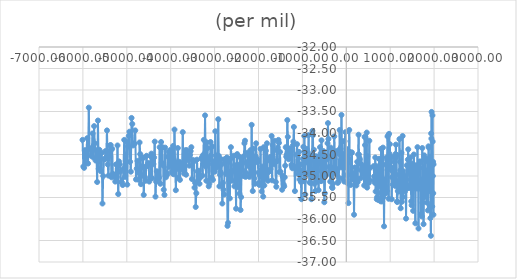
| Category | (per mil) |
|---|---|
| 1986.88 | -34.73 |
| 1983.99 | -35.9 |
| 1980.08 | -35.4 |
| 1976.37 | -34.67 |
| 1971.83 | -35 |
| 1967.33 | -34.2 |
| 1962.41 | -33.59 |
| 1957.62 | -35.71 |
| 1953.06 | -34.76 |
| 1947.75 | -34.71 |
| 1942.95 | -33.51 |
| 1938.21 | -34.13 |
| 1932.76 | -34.01 |
| 1927.46 | -36.39 |
| 1921.03 | -35.7 |
| 1915.12 | -35.98 |
| 1909.73 | -34.55 |
| 1903.32 | -34.94 |
| 1896.56 | -35.25 |
| 1890.69 | -34.96 |
| 1884.9 | -35.27 |
| 1878.68 | -34.34 |
| 1872.68 | -34.31 |
| 1865.9 | -35.35 |
| 1859.36 | -35.8 |
| 1853.17 | -34.61 |
| 1846.59 | -35.37 |
| 1839.08 | -35.62 |
| 1832.17 | -35.07 |
| 1826.73 | -34.93 |
| 1819.55 | -34.87 |
| 1811.43 | -35.44 |
| 1804.94 | -34.66 |
| 1797.57 | -35.22 |
| 1790.65 | -34.59 |
| 1783.79 | -35.5 |
| 1775.57 | -34.52 |
| 1768.16 | -35.05 |
| 1759.77 | -36.12 |
| 1752.74 | -35.09 |
| 1745.72 | -35.16 |
| 1737.3 | -35.62 |
| 1730.16 | -34.35 |
| 1722.77 | -35.94 |
| 1714.84 | -35.15 |
| 1706.74 | -35.31 |
| 1698.52 | -35.89 |
| 1691.22 | -35.09 |
| 1683.91 | -35.17 |
| 1676.8 | -34.66 |
| 1668.67 | -34.81 |
| 1660.0 | -34.82 |
| 1652.5 | -34.72 |
| 1645.0 | -36.22 |
| 1636.67 | -34.88 |
| 1629.67 | -35.29 |
| 1621.33 | -34.33 |
| 1613.67 | -35.26 |
| 1604.67 | -34.89 |
| 1597.0 | -35.23 |
| 1588.67 | -35.29 |
| 1581.0 | -34.9 |
| 1573.0 | -36.1 |
| 1564.0 | -34.75 |
| 1554.67 | -34.83 |
| 1546.5 | -35.23 |
| 1538.67 | -34.5 |
| 1530.67 | -35.14 |
| 1522.5 | -35.81 |
| 1512.67 | -35.05 |
| 1504.67 | -34.88 |
| 1497.0 | -34.71 |
| 1488.67 | -35.68 |
| 1479.75 | -35.59 |
| 1470.0 | -35.08 |
| 1460.33 | -34.57 |
| 1452.0 | -35.25 |
| 1443.5 | -34.93 |
| 1434.67 | -35.28 |
| 1427.0 | -34.62 |
| 1419.0 | -34.84 |
| 1410.67 | -34.38 |
| 1402.0 | -34.62 |
| 1393.5 | -35.28 |
| 1386.0 | -35.22 |
| 1377.33 | -34.75 |
| 1369.0 | -35.28 |
| 1361.0 | -35.99 |
| 1352.33 | -35.1 |
| 1343.67 | -35.26 |
| 1335.33 | -35.36 |
| 1326.67 | -35.11 |
| 1317.67 | -34.99 |
| 1309.33 | -34.99 |
| 1300.5 | -34.89 |
| 1291.5 | -35.49 |
| 1283.08 | -34.07 |
| 1274.37 | -34.95 |
| 1265.67 | -35.6 |
| 1256.8200000000002 | -34.46 |
| 1247.26 | -35.05 |
| 1238.9 | -35.75 |
| 1230.0 | -34.87 |
| 1219.8899999999999 | -34.67 |
| 1211.27 | -34.14 |
| 1201.1100000000001 | -35.36 |
| 1191.65 | -34.97 |
| 1182.7 | -35.12 |
| 1173.29 | -35.35 |
| 1163.45 | -35.6 |
| 1155.22 | -35.6 |
| 1146.22 | -34.51 |
| 1137.96 | -34.57 |
| 1130.04 | -34.27 |
| 1121.0 | -34.49 |
| 1112.47 | -35.23 |
| 1104.15 | -34.56 |
| 1095.5 | -35.12 |
| 1087.52 | -34.67 |
| 1077.9 | -35.01 |
| 1067.5700000000002 | -34.82 |
| 1060.27 | -35.2 |
| 1051.69 | -34.88 |
| 1043.21 | -35.03 |
| 1034.96 | -35.54 |
| 1025.05 | -34.57 |
| 1017.62 | -34.55 |
| 1008.96 | -34.85 |
| 1000.33 | -34.78 |
| 992.22 | -34.26 |
| 982.26 | -34.48 |
| 974.11 | -34.02 |
| 965.67 | -35.53 |
| 956.67 | -34.05 |
| 948.12 | -34.6 |
| 939.45 | -34.08 |
| 930.93 | -34.63 |
| 922.3900000000001 | -35.35 |
| 913.1600000000001 | -34.57 |
| 903.6800000000001 | -35.4 |
| 895.1700000000001 | -34.73 |
| 886.3299999999999 | -35.24 |
| 878.1500000000001 | -35.13 |
| 869.1500000000001 | -35.08 |
| 859.8699999999999 | -36.17 |
| 851.8199999999999 | -35.12 |
| 843.6400000000001 | -35.49 |
| 834.94 | -34.34 |
| 825.73 | -35.4 |
| 817.6800000000001 | -35.59 |
| 809.71 | -35.27 |
| 800.1500000000001 | -34.86 |
| 791.8199999999999 | -34.37 |
| 783.6199999999999 | -35.59 |
| 774.53 | -35.09 |
| 765.9100000000001 | -35.22 |
| 756.7 | -34.61 |
| 748.6800000000001 | -34.6 |
| 740.4300000000001 | -34.93 |
| 731.8800000000001 | -35.56 |
| 722.5899999999999 | -35.39 |
| 712.9000000000001 | -34.88 |
| 703.24 | -35.49 |
| 694.4300000000001 | -35.54 |
| 685.8299999999999 | -34.77 |
| 677.5999999999999 | -34.97 |
| 668.8900000000001 | -35.36 |
| 659.8499999999999 | -34.57 |
| 651.54 | -35.16 |
| 641.4300000000001 | -35.1 |
| 633.0 | -35.01 |
| 624.21 | -34.77 |
| 543.46 | -34.81 |
| 534.3199999999999 | -35.1 |
| 523.8499999999999 | -34.18 |
| 514.04 | -35.16 |
| 503.45000000000005 | -34.82 |
| 493.3699999999999 | -35.13 |
| 483.4100000000001 | -34.54 |
| 474.9200000000001 | -35.27 |
| 465.77 | -33.99 |
| 456.70000000000005 | -34.89 |
| 447.20000000000005 | -35.21 |
| 436.73 | -34.1 |
| 427.80999999999995 | -34.28 |
| 417.44000000000005 | -34.09 |
| 408.0999999999999 | -35.22 |
| 388.22 | -34.8 |
| 369.6199999999999 | -34.95 |
| 360.21000000000004 | -34.81 |
| 349.5 | -34.74 |
| 338.9100000000001 | -34.87 |
| 330.18000000000006 | -35.05 |
| 319.95000000000005 | -34.7 |
| 310.56999999999994 | -34.62 |
| 299.73 | -34.58 |
| 289.29999999999995 | -34.5 |
| 279.71000000000004 | -34.04 |
| 270.45000000000005 | -34.5 |
| 259.6400000000001 | -35.14 |
| 249.21000000000004 | -34.67 |
| 239.3699999999999 | -35.11 |
| 229.3599999999999 | -35.22 |
| 218.95000000000005 | -35.04 |
| 208.74 | -35.02 |
| 199.0 | -34.8 |
| 187.95000000000005 | -35.01 |
| 176.5 | -35.9 |
| 165.41000000000008 | -35.07 |
| 156.1099999999999 | -34.97 |
| 145.44000000000005 | -34.92 |
| 136.17000000000007 | -35.08 |
| 127.1099999999999 | -34.45 |
| 117.17000000000007 | -34.47 |
| 106.94000000000005 | -34.98 |
| 96.79999999999995 | -35.21 |
| 86.08999999999992 | -34.67 |
| 76.8900000000001 | -34.44 |
| 67.17000000000007 | -33.93 |
| 58.819999999999936 | -34.68 |
| 48.58999999999992 | -35.63 |
| 39.90000000000009 | -34.68 |
| 30.470000000000027 | -35.17 |
| 20.799999999999955 | -34.53 |
| 11.0 | -34.98 |
| 1.349999999999909 | -34.37 |
| -8.299999999999955 | -34.8 |
| -18.170000000000073 | -33.98 |
| -37.75 | -34.19 |
| -46.61999999999989 | -35.13 |
| -57.710000000000036 | -34.81 |
| -68.68000000000006 | -34.48 |
| -80.18000000000006 | -35.06 |
| -89.75 | -34.19 |
| -100.5 | -34.5 |
| -110.15999999999985 | -33.58 |
| -119.82000000000016 | -34.8 |
| -129.69999999999982 | -34.51 |
| -139.80999999999995 | -34.36 |
| -150.42999999999984 | -33.93 |
| -160.26999999999998 | -34.41 |
| -170.86000000000013 | -35.04 |
| -182.55999999999995 | -35.13 |
| -193.3800000000001 | -35.16 |
| -203.55000000000018 | -34.84 |
| -213.63999999999987 | -34.96 |
| -223.82999999999993 | -34.42 |
| -234.17000000000007 | -34.91 |
| -244.23999999999978 | -34.5 |
| -253.76000000000022 | -34.84 |
| -264.3000000000002 | -34.59 |
| -274.0 | -34.08 |
| -284.15999999999985 | -34.8 |
| -294.1500000000001 | -34.43 |
| -304.0 | -35.18 |
| -314.5500000000002 | -35.28 |
| -324.9000000000001 | -35.26 |
| -334.9499999999998 | -34.95 |
| -344.9499999999998 | -34.55 |
| -355.1100000000001 | -34.34 |
| -365.73 | -35.13 |
| -375.84000000000015 | -34.88 |
| -396.1999999999998 | -34.79 |
| -407.07000000000016 | -34.14 |
| -417.5799999999999 | -33.77 |
| -427.4499999999998 | -34.24 |
| -437.6100000000001 | -34.61 |
| -447.6300000000001 | -34.55 |
| -458.0999999999999 | -34.97 |
| -469.07000000000016 | -34.99 |
| -479.0 | -34.62 |
| -489.6700000000001 | -35.4 |
| -500.5799999999999 | -35.61 |
| -511.5 | -34.51 |
| -521.9000000000001 | -34.42 |
| -532.0799999999999 | -34.75 |
| -542.1500000000001 | -34.82 |
| -554.5300000000002 | -35.1 |
| -565.1300000000001 | -34.17 |
| -576.0 | -35.12 |
| -586.69 | -34.48 |
| -598.4499999999998 | -34.33 |
| -609.46 | -34.54 |
| -619.9499999999998 | -34.63 |
| -631.4000000000001 | -35.33 |
| -641.8899999999999 | -34.56 |
| -652.48 | -34.88 |
| -662.7600000000002 | -35.13 |
| -673.3899999999999 | -35.13 |
| -684.04 | -34.79 |
| -694.3499999999999 | -34.54 |
| -705.25 | -35.35 |
| -716.5500000000002 | -34.97 |
| -726.6999999999998 | -35.18 |
| -738.1999999999998 | -34.39 |
| -749.1700000000001 | -35.01 |
| -759.3600000000001 | -34.05 |
| -771.5300000000002 | -33.95 |
| -784.3200000000002 | -34.85 |
| -795.52 | -35.54 |
| -806.1399999999999 | -34.88 |
| -816.7399999999998 | -35.16 |
| -827.81 | -34.52 |
| -838.1399999999999 | -35.15 |
| -848.2600000000002 | -34.96 |
| -858.6999999999998 | -34.05 |
| -868.75 | -34.92 |
| -879.5300000000002 | -34.44 |
| -890.6300000000001 | -34.65 |
| -901.5999999999999 | -34.37 |
| -912.5 | -34.47 |
| -923.2600000000002 | -34.58 |
| -933.7800000000002 | -35.43 |
| -945.06 | -34.7 |
| -956.19 | -34.07 |
| -966.5 | -35.12 |
| -977.0500000000002 | -34.32 |
| -987.8000000000002 | -34.6 |
| -998.5900000000001 | -34.72 |
| -1010.23 | -34.88 |
| -1021.23 | -35.54 |
| -1032.81 | -35.14 |
| -1043.0 | -34.93 |
| -1054.0 | -34.73 |
| -1064.56 | -35.08 |
| -1075.44 | -34.44 |
| -1086.12 | -34.84 |
| -1097.1599999999999 | -34.95 |
| -1108.31 | -34.85 |
| -1120.4099999999999 | -34.26 |
| -1132.92 | -34.5 |
| -1145.6 | -34.82 |
| -1159.0 | -34.81 |
| -1170.17 | -35.35 |
| -1181.8899999999999 | -34.78 |
| -1194.15 | -33.86 |
| -1205.54 | -34.2 |
| -1217.4499999999998 | -34.29 |
| -1228.5700000000002 | -34.82 |
| -1238.5 | -34.78 |
| -1249.1399999999999 | -34.74 |
| -1260.9299999999998 | -34.42 |
| -1274.6799999999998 | -34.54 |
| -1286.71 | -34.36 |
| -1297.3899999999999 | -34.54 |
| -1309.0500000000002 | -34.61 |
| -1320.63 | -34.46 |
| -1332.44 | -34.09 |
| -1343.35 | -33.7 |
| -1355.4899999999998 | -34.5 |
| -1367.85 | -34.55 |
| -1379.4 | -34.33 |
| -1390.6999999999998 | -34.76 |
| -1403.0500000000002 | -35.03 |
| -1414.38 | -35.24 |
| -1426.5700000000002 | -35.2 |
| -1437.8200000000002 | -35.01 |
| -1449.88 | -35 |
| -1462.19 | -35.32 |
| -1498.4099999999999 | -34.9 |
| -1510.6799999999998 | -34.44 |
| -1522.9099999999999 | -34.91 |
| -1534.29 | -34.23 |
| -1546.5 | -34.16 |
| -1558.4 | -34.34 |
| -1569.4899999999998 | -34.65 |
| -1581.52 | -34.4 |
| -1593.9699999999998 | -35.25 |
| -1605.81 | -35.14 |
| -1618.1100000000001 | -34.68 |
| -1629.0 | -34.69 |
| -1640.56 | -34.18 |
| -1652.0300000000002 | -34.73 |
| -1665.2800000000002 | -34.63 |
| -1677.3200000000002 | -34.28 |
| -1689.3000000000002 | -35.1 |
| -1701.06 | -34.07 |
| -1713.9299999999998 | -34.65 |
| -1725.5900000000001 | -34.84 |
| -1736.7199999999998 | -34.56 |
| -1747.83 | -34.87 |
| -1760.0300000000002 | -34.88 |
| -1772.0700000000002 | -34.91 |
| -1784.5 | -35.11 |
| -1796.38 | -34.64 |
| -1808.1999999999998 | -34.24 |
| -1820.44 | -35.05 |
| -1832.6799999999998 | -34.41 |
| -1843.87 | -35.05 |
| -1855.92 | -34.93 |
| -1868.0900000000001 | -35.22 |
| -1880.56 | -34.33 |
| -1892.9099999999999 | -35.48 |
| -1905.1799999999998 | -34.92 |
| -1916.8200000000002 | -34.78 |
| -1928.8600000000001 | -35.36 |
| -1941.6 | -35.01 |
| -1953.94 | -34.37 |
| -1966.31 | -34.99 |
| -1979.1999999999998 | -35.21 |
| -1991.12 | -35.16 |
| -2003.5500000000002 | -34.92 |
| -2017.06 | -34.68 |
| -2029.4299999999998 | -34.61 |
| -2042.29 | -34.61 |
| -2054.45 | -34.24 |
| -2066.68 | -34.54 |
| -2080.21 | -35.18 |
| -2092.56 | -35.06 |
| -2104.94 | -34.63 |
| -2117.61 | -34.36 |
| -2130.64 | -35.35 |
| -2143.74 | -34.78 |
| -2155.8999999999996 | -33.81 |
| -2168.96 | -34.96 |
| -2182.1899999999996 | -34.4 |
| -2195.0 | -34.79 |
| -2207.5200000000004 | -35.02 |
| -2219.26 | -34.53 |
| -2231.8199999999997 | -34.76 |
| -2244.1499999999996 | -34.46 |
| -2256.6099999999997 | -34.7 |
| -2269.25 | -34.68 |
| -2281.6499999999996 | -34.93 |
| -2293.74 | -35.02 |
| -2307.38 | -34.18 |
| -2320.4700000000003 | -34.24 |
| -2332.6000000000004 | -34.54 |
| -2345.3199999999997 | -35 |
| -2357.3599999999997 | -34.69 |
| -2370.1400000000003 | -34.86 |
| -2383.33 | -34.59 |
| -2395.59 | -35.49 |
| -2409.0600000000004 | -35.79 |
| -2421.3599999999997 | -34.56 |
| -2434.2299999999996 | -35.41 |
| -2446.9399999999996 | -34.74 |
| -2460.21 | -34.79 |
| -2472.63 | -35.26 |
| -2485.4799999999996 | -34.49 |
| -2498.04 | -34.52 |
| -2510.3 | -35.76 |
| -2523.2200000000003 | -34.88 |
| -2536.16 | -34.75 |
| -2549.46 | -35.24 |
| -2562.88 | -34.53 |
| -2575.2700000000004 | -34.89 |
| -2588.3999999999996 | -34.87 |
| -2601.8900000000003 | -35.11 |
| -2615.08 | -34.58 |
| -2628.24 | -34.33 |
| -2640.8199999999997 | -34.9 |
| -2653.8999999999996 | -35.52 |
| -2667.1400000000003 | -35.11 |
| -2680.6800000000003 | -34.67 |
| -2693.45 | -36.09 |
| -2706.37 | -36.16 |
| -2719.83 | -34.57 |
| -2731.5600000000004 | -34.6 |
| -2744.3100000000004 | -34.95 |
| -2758.6400000000003 | -34.68 |
| -2771.16 | -34.61 |
| -2784.0 | -35.43 |
| -2797.3500000000004 | -35.32 |
| -2811.3599999999997 | -35.16 |
| -2824.13 | -35.64 |
| -2838.4700000000003 | -34.73 |
| -2851.8 | -34.61 |
| -2864.75 | -34.91 |
| -2878.16 | -34.97 |
| -2890.7 | -35.24 |
| -2904.0600000000004 | -34.53 |
| -2916.92 | -33.68 |
| -2930.1800000000003 | -34.76 |
| -2943.6899999999996 | -34.67 |
| -2956.79 | -34.52 |
| -2970.1099999999997 | -34.82 |
| -2983.2700000000004 | -33.96 |
| -2996.3 | -34.9 |
| -3009.17 | -34.66 |
| -3023.2700000000004 | -34.71 |
| -3037.5 | -35.09 |
| -3050.66 | -34.31 |
| -3065.09 | -35.04 |
| -3078.6499999999996 | -34.52 |
| -3091.6899999999996 | -34.21 |
| -3104.7 | -34.57 |
| -3119.84 | -35.18 |
| -3133.5600000000004 | -35.24 |
| -3147.29 | -34.73 |
| -3160.46 | -34.35 |
| -3175.04 | -34.22 |
| -3188.67 | -35.11 |
| -3202.71 | -34.78 |
| -3217.0600000000004 | -33.59 |
| -3230.66 | -34.74 |
| -3245.2 | -34.16 |
| -3259.7 | -34.51 |
| -3273.66 | -34.99 |
| -3287.8 | -34.56 |
| -3301.0 | -34.6 |
| -3329.5 | -35.04 |
| -3344.09 | -35.18 |
| -3359.08 | -34.88 |
| -3373.3900000000003 | -35.1 |
| -3388.08 | -34.89 |
| -3402.21 | -34.62 |
| -3416.0699999999997 | -35.4 |
| -3430.1899999999996 | -35.72 |
| -3443.63 | -35.16 |
| -3457.4300000000003 | -35.27 |
| -3471.9700000000003 | -34.66 |
| -3487.13 | -34.63 |
| -3501.33 | -34.65 |
| -3515.7299999999996 | -35.07 |
| -3530.3599999999997 | -34.33 |
| -3545.5600000000004 | -34.42 |
| -3560.8999999999996 | -34.51 |
| -3576.3599999999997 | -34.76 |
| -3590.71 | -34.51 |
| -3605.55 | -34.57 |
| -3620.6800000000003 | -34.63 |
| -3634.3100000000004 | -34.4 |
| -3649.67 | -34.97 |
| -3663.8100000000004 | -34.4 |
| -3679.8100000000004 | -34.49 |
| -3695.2 | -34.94 |
| -3710.13 | -34.83 |
| -3725.29 | -33.98 |
| -3742.1400000000003 | -34.84 |
| -3757.8900000000003 | -34.76 |
| -3773.8199999999997 | -34.71 |
| -3789.3199999999997 | -35.09 |
| -3805.71 | -34.67 |
| -3822.12 | -35.04 |
| -3837.1000000000004 | -34.35 |
| -3852.9399999999996 | -34.68 |
| -3868.46 | -34.83 |
| -3882.91 | -35.33 |
| -3898.8100000000004 | -34.75 |
| -3913.79 | -33.92 |
| -3929.0699999999997 | -34.96 |
| -3944.12 | -34.3 |
| -3959.0 | -34.94 |
| -3974.41 | -34.9 |
| -3989.3100000000004 | -34.51 |
| -4004.4300000000003 | -34.39 |
| -4019.75 | -34.69 |
| -4033.29 | -34.79 |
| -4048.5200000000004 | -34.44 |
| -4063.87 | -34.55 |
| -4079.62 | -34.97 |
| -4094.2 | -34.92 |
| -4110.24 | -35.03 |
| -4125.93 | -34.34 |
| -4142.18 | -35.44 |
| -4158.29 | -35.32 |
| -4174.5 | -34.75 |
| -4190.63 | -34.33 |
| -4205.0 | -34.69 |
| -4218.83 | -34.21 |
| -4234.88 | -35.18 |
| -4251.43 | -34.33 |
| -4266.86 | -35.04 |
| -4283.21 | -34.98 |
| -4299.88 | -35.08 |
| -4316.2 | -34.89 |
| -4332.33 | -35.13 |
| -4346.91 | -35.48 |
| -4363.36 | -34.2 |
| -4378.69 | -34.57 |
| -4394.4 | -34.72 |
| -4409.58 | -34.56 |
| -4425.14 | -35.05 |
| -4439.81 | -34.48 |
| -4456.5 | -34.54 |
| -4472.37 | -35.04 |
| -4488.12 | -35.13 |
| -4504.07 | -34.7 |
| -4519.71 | -34.71 |
| -4536.21 | -34.77 |
| -4552.0 | -34.53 |
| -4567.33 | -35.11 |
| -4583.77 | -34.79 |
| -4599.23 | -35.01 |
| -4614.13 | -35.44 |
| -4630.08 | -34.58 |
| -4646.04 | -34.59 |
| -4661.25 | -34.98 |
| -4677.08 | -35.19 |
| -4693.92 | -34.49 |
| -4709.05 | -34.22 |
| -4725.25 | -35.09 |
| -4741.64 | -34.91 |
| -4757.33 | -34.65 |
| -4774.3 | -34.83 |
| -4790.25 | -35.08 |
| -4807.26 | -33.94 |
| -4824.04 | -34.25 |
| -4840.67 | -34.24 |
| -4858.91 | -34.29 |
| -4875.29 | -33.79 |
| -4891.69 | -33.65 |
| -4908.26 | -34.9 |
| -4923.58 | -34.67 |
| -4940.17 | -33.97 |
| -4956.45 | -34.07 |
| -4972.73 | -34.31 |
| -4989.24 | -35.2 |
| -5006.25 | -34.2 |
| -5024.0 | -34.65 |
| -5040.59 | -35.02 |
| -5058.16 | -34.16 |
| -5075.08 | -34.83 |
| -5092.42 | -35.21 |
| -5110.1 | -35.15 |
| -5126.83 | -35.14 |
| -5144.28 | -34.9 |
| -5161.27 | -34.73 |
| -5178.21 | -34.66 |
| -5195.08 | -35.42 |
| -5211.5 | -34.29 |
| -5227.06 | -35.03 |
| -5245.32 | -34.73 |
| -5262.55 | -35.13 |
| -5279.61 | -35.02 |
| -5297.2 | -34.98 |
| -5315.5 | -34.95 |
| -5332.83 | -34.37 |
| -5349.06 | -35.03 |
| -5366.27 | -34.28 |
| -5383.96 | -34.29 |
| -5400.86 | -34.42 |
| -5417.52 | -34.99 |
| -5434.26 | -34.73 |
| -5451.25 | -33.94 |
| -5469.24 | -34.58 |
| -5485.32 | -34.42 |
| -5502.23 | -34.61 |
| -5519.42 | -34.61 |
| -5536.77 | -35 |
| -5554.37 | -35.64 |
| -5571.92 | -34.46 |
| -5590.25 | -34.89 |
| -5606.67 | -34.59 |
| -5623.11 | -34.39 |
| -5640.41 | -34.83 |
| -5657.36 | -33.71 |
| -5675.05 | -35.14 |
| -5693.04 | -34.4 |
| -5710.04 | -34.64 |
| -5728.27 | -34.24 |
| -5744.75 | -33.84 |
| -5761.95 | -34.57 |
| -5780.52 | -34.01 |
| -5797.83 | -34.45 |
| -5815.04 | -34.53 |
| -5832.1 | -34.37 |
| -5849.36 | -34.35 |
| -5865.85 | -33.41 |
| -5882.76 | -34.71 |
| -5901.36 | -34.12 |
| -5918.81 | -34.41 |
| -5936.05 | -34.7 |
| -5953.95 | -34.4 |
| -5972.17 | -34.81 |
| -5989.58 | -34.78 |
| -6008.71 | -34.16 |